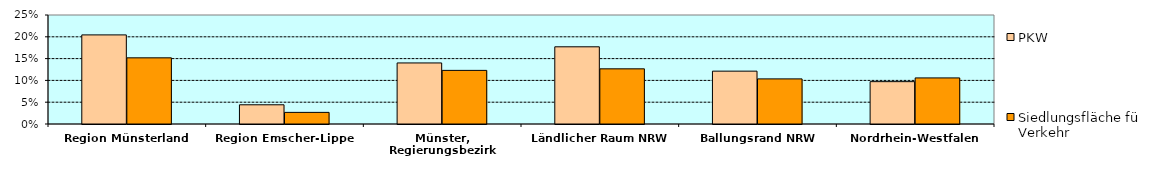
| Category | PKW | Siedlungsfläche für Verkehr |
|---|---|---|
| Region Münsterland | 0.204 | 0.152 |
| Region Emscher-Lippe | 0.044 | 0.027 |
| Münster, Regierungsbezirk | 0.14 | 0.123 |
| Ländlicher Raum NRW | 0.177 | 0.127 |
| Ballungsrand NRW | 0.121 | 0.103 |
| Nordrhein-Westfalen | 0.097 | 0.106 |